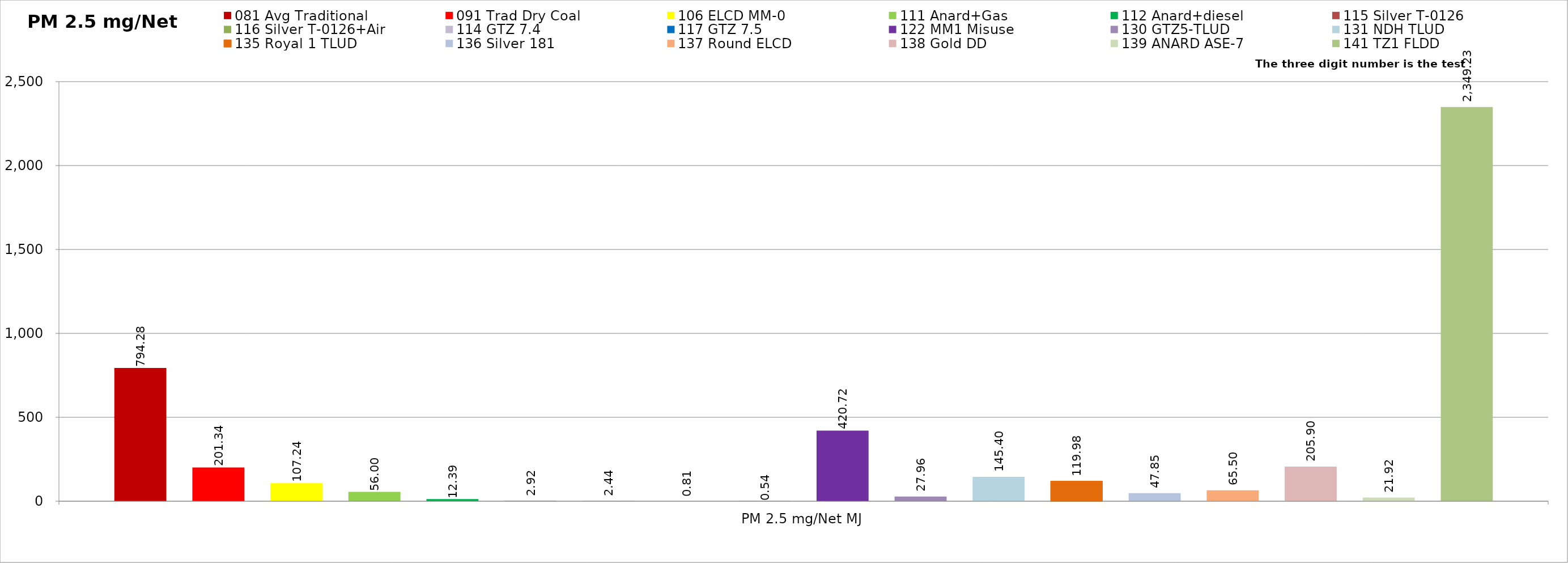
| Category | 081 Avg Traditional | 091 Trad Dry Coal | 106 ELCD MM-0 | 111 Anard+Gas | 112 Anard+diesel | 115 Silver T-0126 | 116 Silver T-0126+Air | 114 GTZ 7.4 | 117 GTZ 7.5 | 122 MM1 Misuse | 130 GTZ5-TLUD | 131 NDH TLUD | 135 Royal 1 TLUD | 136 Silver 181 | 137 Round ELCD | 138 Gold DD | 139 ANARD ASE-7 | 141 TZ1 FLDD |
|---|---|---|---|---|---|---|---|---|---|---|---|---|---|---|---|---|---|---|
| PM 2.5 mg/Net MJ | 794.279 | 201.34 | 107.243 | 56.003 | 12.386 | 2.922 | 2.44 | 0.812 | 0.537 | 420.718 | 27.96 | 145.401 | 119.977 | 47.852 | 65.496 | 205.9 | 21.917 | 2349.229 |